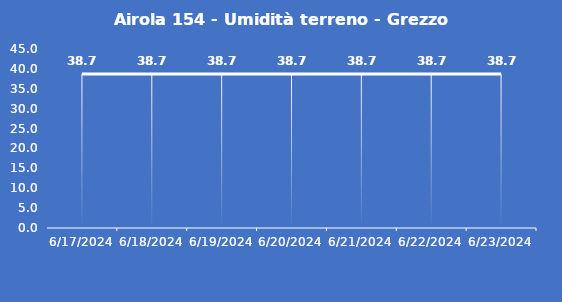
| Category | Airola 154 - Umidità terreno - Grezzo (%VWC) |
|---|---|
| 6/17/24 | 38.7 |
| 6/18/24 | 38.7 |
| 6/19/24 | 38.7 |
| 6/20/24 | 38.7 |
| 6/21/24 | 38.7 |
| 6/22/24 | 38.7 |
| 6/23/24 | 38.7 |